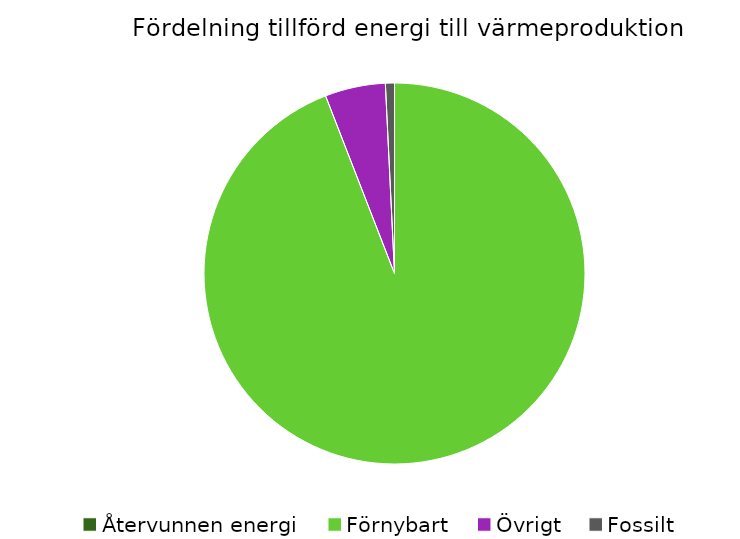
| Category | Fördelning värmeproduktion |
|---|---|
| Återvunnen energi | 0 |
| Förnybart | 0.941 |
| Övrigt | 0.051 |
| Fossilt | 0.008 |